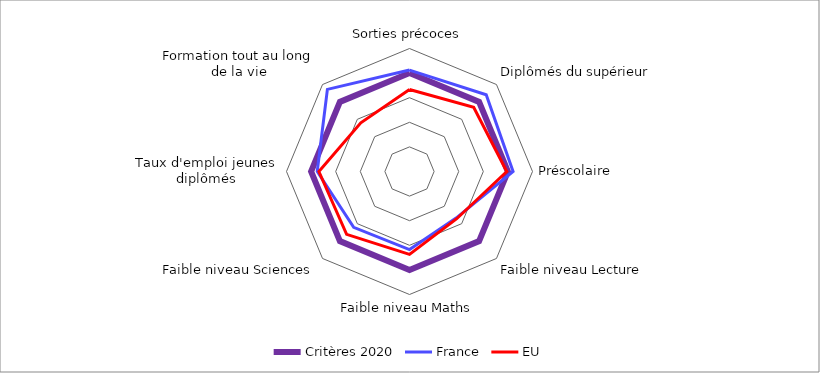
| Category | Critères 2020 | France | EU |
|---|---|---|---|
| Sorties précoces | 1 | 1.031 | 0.833 |
| Diplômés du supérieur | 1 | 1.102 | 0.922 |
| Préscolaire | 1 | 1.053 | 0.988 |
| Faible niveau Lecture | 1 | 0.67 | 0.679 |
| Faible niveau Maths | 1 | 0.794 | 0.843 |
| Faible niveau Sciences | 1 | 0.802 | 0.904 |
| Taux d'emploi jeunes diplômés | 1 | 0.938 | 0.921 |
| Formation tout au long de la vie | 1 | 1.18 | 0.7 |